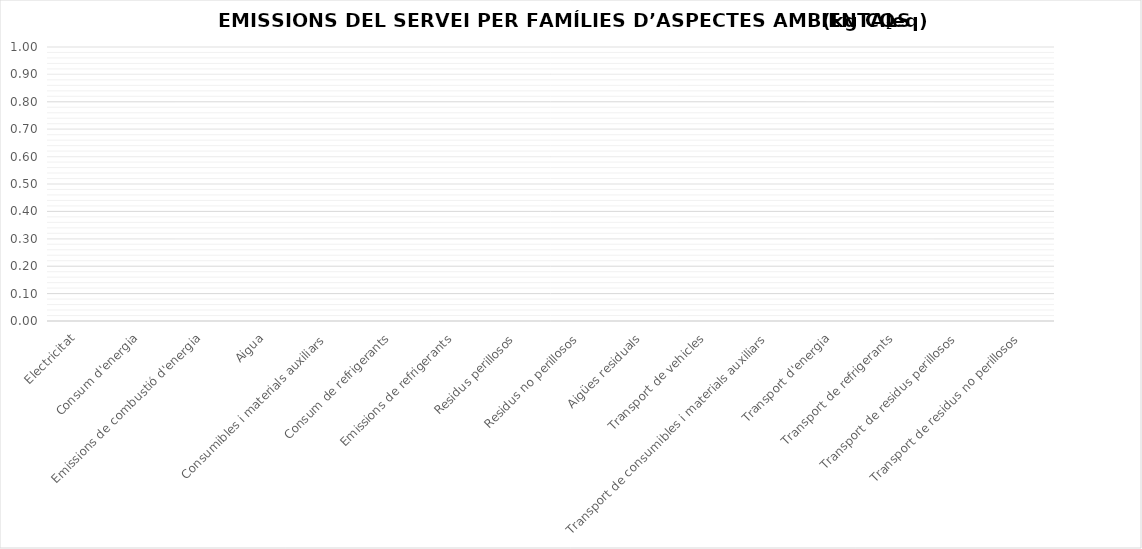
| Category | Extracció i producció de Mat. Auxiliars | Transports Aigües Amunt (Mat. Aux., Energia i Vehicles) | Producció |
|---|---|---|---|
| Electricitat | 0 | 0 | 0 |
| Consum d'energia | 0 | 0 | 0 |
| Emissions de combustió d'energia | 0 | 0 | 0 |
| Aigua | 0 | 0 | 0 |
| Consumibles i materials auxiliars | 0 | 0 | 0 |
| Consum de refrigerants | 0 | 0 | 0 |
| Emissions de refrigerants | 0 | 0 | 0 |
| Residus perillosos | 0 | 0 | 0 |
| Residus no perillosos | 0 | 0 | 0 |
| Aigües residuals | 0 | 0 | 0 |
| Transport de vehicles | 0 | 0 | 0 |
| Transport de consumibles i materials auxiliars | 0 | 0 | 0 |
| Transport d'energia | 0 | 0 | 0 |
| Transport de refrigerants | 0 | 0 | 0 |
| Transport de residus perillosos | 0 | 0 | 0 |
| Transport de residus no perillosos | 0 | 0 | 0 |